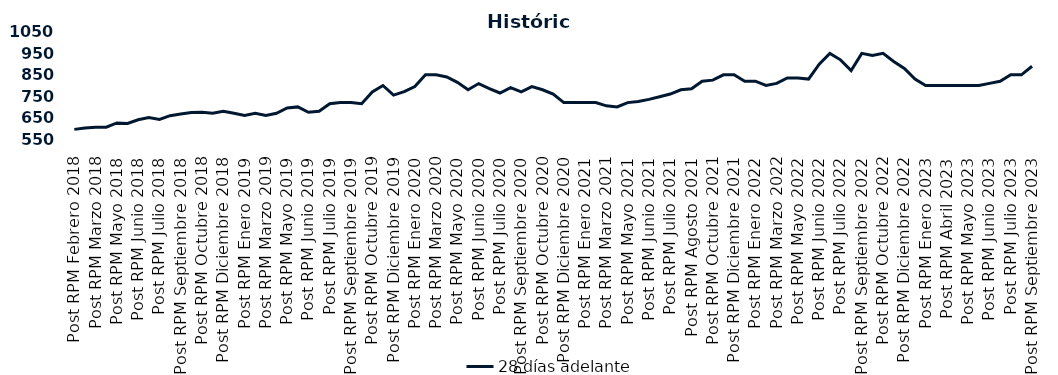
| Category | 28 días adelante |
|---|---|
| Post RPM Febrero 2018 | 595 |
| Pre RPM Marzo 2018 | 601 |
| Post RPM Marzo 2018 | 605 |
| Pre RPM Mayo 2018 | 605 |
| Post RPM Mayo 2018 | 625 |
| Pre RPM Junio 2018 | 623 |
| Post RPM Junio 2018 | 640 |
| Pre RPM Julio 2018 | 650 |
| Post RPM Julio 2018 | 641 |
| Pre RPM Septiembre 2018 | 659 |
| Post RPM Septiembre 2018 | 666.75 |
| Pre RPM Octubre 2018 | 674 |
| Post RPM Octubre 2018 | 675 |
| Pre RPM Diciembre 2018 | 670 |
| Post RPM Diciembre 2018 | 680 |
| Pre RPM Enero 2019 | 670 |
| Post RPM Enero 2019 | 660 |
| Pre RPM Marzo 2019 | 670 |
| Post RPM Marzo 2019 | 660 |
| Pre RPM Mayo 2019 | 670 |
| Post RPM Mayo 2019 | 695 |
| Pre RPM Junio 2019 | 700 |
| Post RPM Junio 2019 | 675 |
| Pre RPM Julio 2019 | 680 |
| Post RPM Julio 2019 | 715 |
| Pre RPM Septiembre 2019 | 720 |
| Post RPM Septiembre 2019 | 720 |
| Pre RPM Octubre 2019 | 715 |
| Post RPM Octubre 2019 | 770 |
| Pre RPM Diciembre 2019 | 800 |
| Post RPM Diciembre 2019 | 755 |
| Pre RPM Enero 2020 | 771 |
| Post RPM Enero 2020 | 795 |
| Pre RPM Marzo 2020 | 850 |
| Post RPM Marzo 2020 | 850 |
| Pre RPM Mayo 2020 | 840 |
| Post RPM Mayo 2020 | 815 |
| Pre RPM Junio 2020 | 780 |
| Post RPM Junio 2020 | 809 |
| Pre RPM Julio 2020 | 785.72 |
| Post RPM Julio 2020 | 765 |
| Pre RPM Septiembre 2020 | 790 |
| Post RPM Septiembre 2020 | 770 |
| Pre RPM Octubre 2020 | 795 |
| Post RPM Octubre 2020 | 780 |
| Pre RPM Diciembre 2020 | 760 |
| Post RPM Diciembre 2020 | 720 |
| Pre RPM Enero 2021 | 720 |
| Post RPM Enero 2021 | 720 |
| Pre RPM Marzo 2021 | 720 |
| Post RPM Marzo 2021 | 705 |
| Pre RPM Mayo 2021 | 700 |
| Post RPM Mayo 2021 | 720 |
| Pre RPM Junio 2021 | 725 |
| Post RPM Junio 2021 | 735 |
| Pre RPM Julio 2021 | 747.5 |
| Post RPM Julio 2021 | 760 |
| Pre RPM Agosto 2021 | 780 |
| Post RPM Agosto 2021 | 785 |
| Pre RPM Octubre 2021 | 820 |
| Post RPM Octubre 2021 | 825 |
| Pre RPM Diciembre 2021 | 850 |
| Post RPM Diciembre 2021 | 850 |
| Pre RPM Enero 2022 | 820 |
| Post RPM Enero 2022 | 820 |
| Pre RPM Marzo 2022 | 800 |
| Post RPM Marzo 2022 | 810 |
| Pre RPM Mayo 2022 | 835 |
| Post RPM Mayo 2022 | 835 |
| Pre RPM Junio 2022 | 830 |
| Post RPM Junio 2022 | 900 |
| Pre RPM Julio 2022 | 950 |
| Post RPM Julio 2022 | 920 |
| Pre RPM Septiembre 2022 | 870 |
| Post RPM Septiembre 2022 | 950 |
| Pre RPM Octubre 2022 | 940 |
| Post RPM Octubre 2022 | 950 |
| Pre RPM Diciembre 2022 | 912.5 |
| Post RPM Diciembre 2022 | 880 |
| Pre RPM Enero 2023 | 830 |
| Post RPM Enero 2023 | 800 |
| Pre RPM Abril 2023 | 800 |
| Post RPM Abril 2023 | 800 |
| Pre RPM Mayo 2023 | 800 |
| Post RPM Mayo 2023 | 800 |
| Pre RPM Junio 2023 | 800 |
| Post RPM Junio 2023 | 810 |
| Pre RPM Julio 2023 | 820 |
| Post RPM Julio 2023 | 850 |
| Pre RPM Septiembre 2023 | 850 |
| Post RPM Septiembre 2023 | 890 |